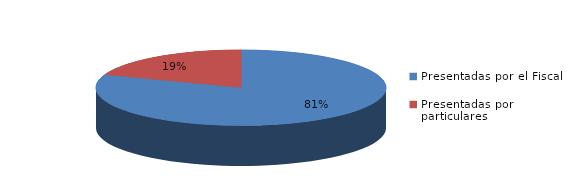
| Category | Series 0 |
|---|---|
| Presentadas por el Fiscal | 614 |
| Presentadas por particulares | 148 |